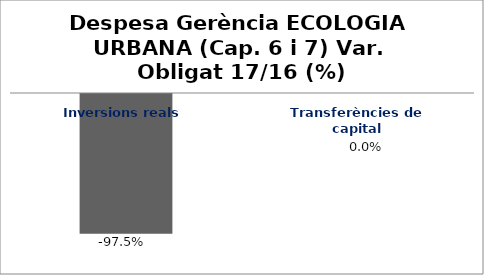
| Category | Series 0 |
|---|---|
| Inversions reals | -0.975 |
| Transferències de capital | 0 |